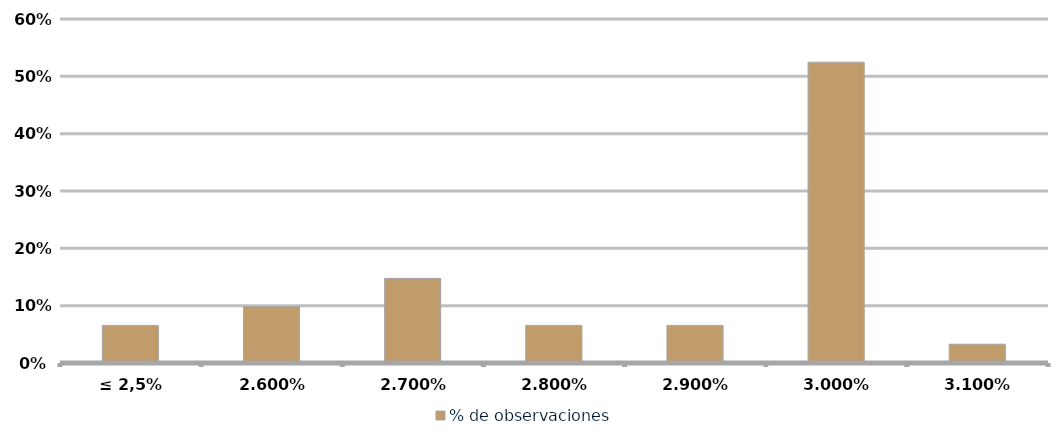
| Category | % de observaciones  |
|---|---|
| ≤ 2,5% | 0.066 |
| 2.60% | 0.098 |
| 2.70% | 0.148 |
| 2.80% | 0.066 |
| 2.90% | 0.066 |
| 3.00% | 0.525 |
| 3.10% | 0.033 |